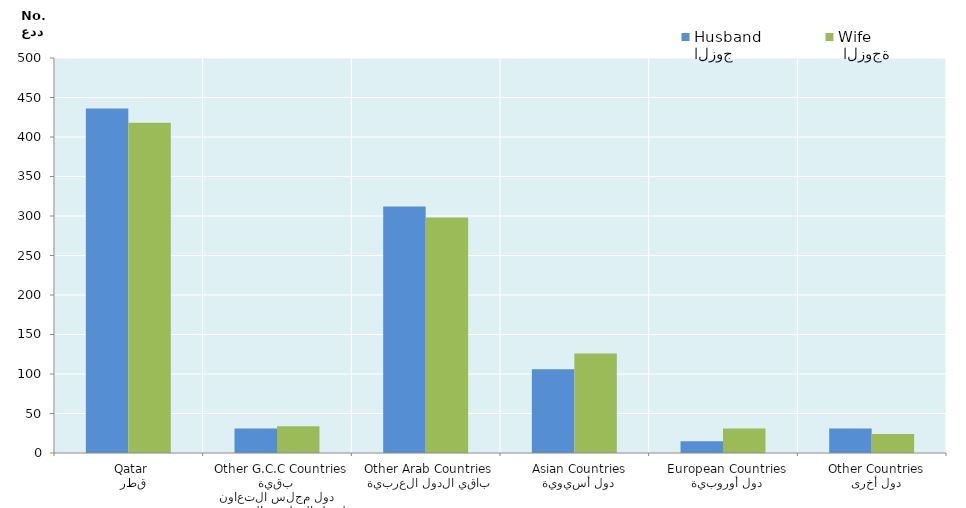
| Category | الزوج
Husband |  الزوجة
Wife |
|---|---|---|
|   قطر
 Qatar | 436 | 418 |
|  بقية دول مجلس التعاون لدول الخليج العربية
  Other G.C.C Countries | 31 | 34 |
|   باقي الدول العربية
 Other Arab Countries | 312 | 298 |
|   دول أسيوية
  Asian Countries | 106 | 126 |
|   دول أوروبية
  European Countries | 15 | 31 |
|   دول أخرى
  Other Countries | 31 | 24 |